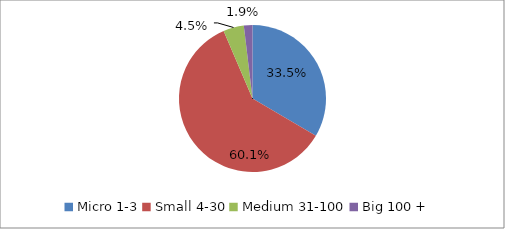
| Category | Percent |
|---|---|
| Micro 1-3 | 0.335 |
| Small 4-30 | 0.601 |
| Medium 31-100 | 0.045 |
| Big 100 + | 0.019 |